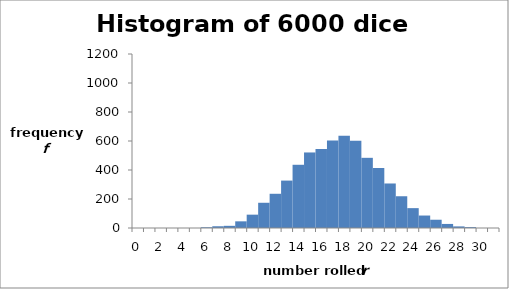
| Category | Series 0 |
|---|---|
| 0.0 | 0 |
| 1.0 | 0 |
| 2.0 | 0 |
| 3.0 | 0 |
| 4.0 | 0 |
| 5.0 | 0 |
| 6.0 | 5 |
| 7.0 | 12 |
| 8.0 | 15 |
| 9.0 | 46 |
| 10.0 | 92 |
| 11.0 | 174 |
| 12.0 | 236 |
| 13.0 | 327 |
| 14.0 | 436 |
| 15.0 | 521 |
| 16.0 | 545 |
| 17.0 | 604 |
| 18.0 | 637 |
| 19.0 | 601 |
| 20.0 | 484 |
| 21.0 | 414 |
| 22.0 | 307 |
| 23.0 | 219 |
| 24.0 | 137 |
| 25.0 | 86 |
| 26.0 | 57 |
| 27.0 | 28 |
| 28.0 | 11 |
| 29.0 | 6 |
| 30.0 | 0 |
| 31.0 | 0 |